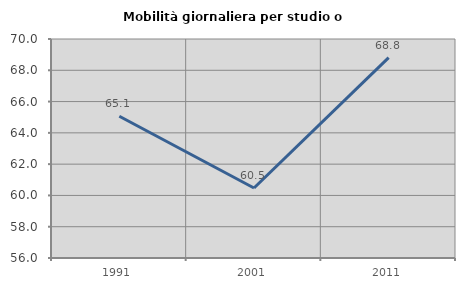
| Category | Mobilità giornaliera per studio o lavoro |
|---|---|
| 1991.0 | 65.064 |
| 2001.0 | 60.477 |
| 2011.0 | 68.809 |